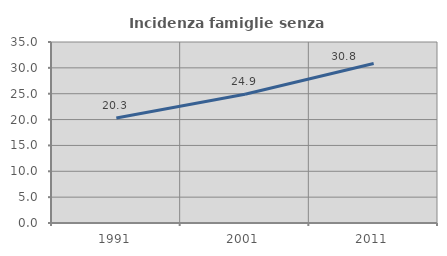
| Category | Incidenza famiglie senza nuclei |
|---|---|
| 1991.0 | 20.322 |
| 2001.0 | 24.885 |
| 2011.0 | 30.845 |